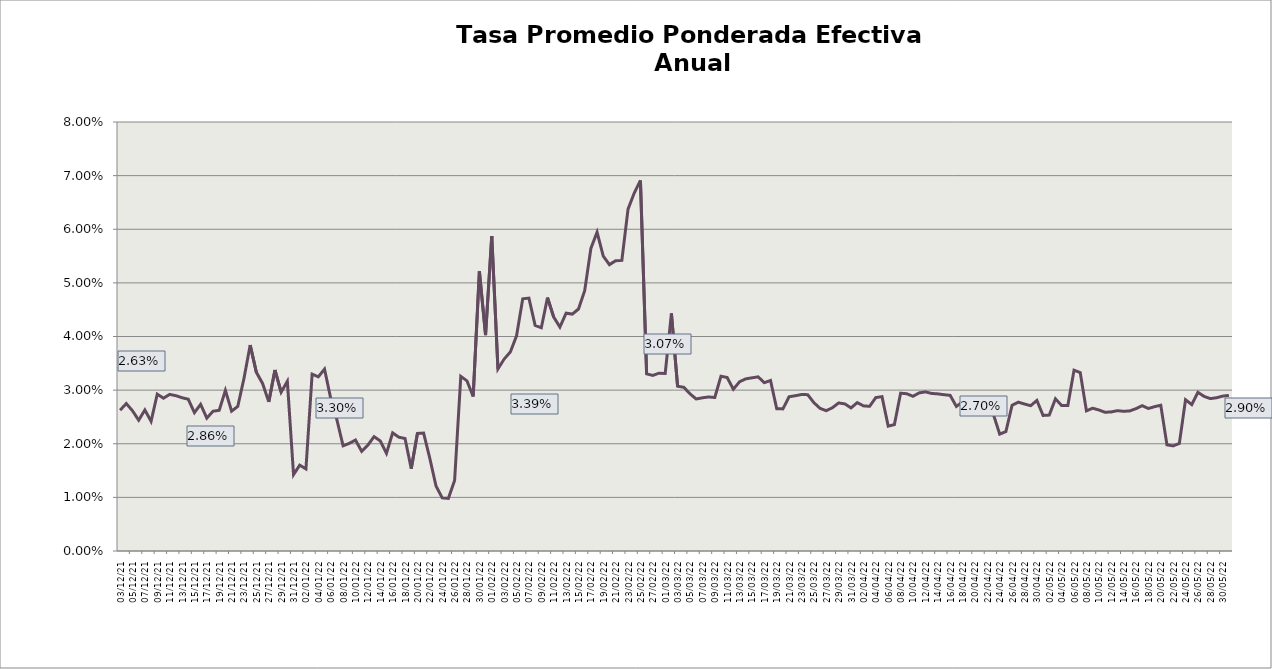
| Category | Tasa Efectiva Anual |
|---|---|
| 2021-12-03 | 0.026 |
| 2021-12-04 | 0.027 |
| 2021-12-05 | 0.026 |
| 2021-12-06 | 0.024 |
| 2021-12-07 | 0.026 |
| 2021-12-08 | 0.024 |
| 2021-12-09 | 0.029 |
| 2021-12-10 | 0.028 |
| 2021-12-11 | 0.029 |
| 2021-12-12 | 0.029 |
| 2021-12-13 | 0.029 |
| 2021-12-14 | 0.028 |
| 2021-12-15 | 0.026 |
| 2021-12-16 | 0.027 |
| 2021-12-17 | 0.025 |
| 2021-12-18 | 0.026 |
| 2021-12-19 | 0.026 |
| 2021-12-20 | 0.03 |
| 2021-12-21 | 0.026 |
| 2021-12-22 | 0.027 |
| 2021-12-23 | 0.032 |
| 2021-12-24 | 0.038 |
| 2021-12-25 | 0.033 |
| 2021-12-26 | 0.031 |
| 2021-12-27 | 0.028 |
| 2021-12-28 | 0.034 |
| 2021-12-29 | 0.03 |
| 2021-12-30 | 0.032 |
| 2021-12-31 | 0.014 |
| 2022-01-01 | 0.016 |
| 2022-01-02 | 0.015 |
| 2022-01-03 | 0.033 |
| 2022-01-04 | 0.032 |
| 2022-01-05 | 0.034 |
| 2022-01-06 | 0.028 |
| 2022-01-07 | 0.024 |
| 2022-01-08 | 0.02 |
| 2022-01-09 | 0.02 |
| 2022-01-10 | 0.021 |
| 2022-01-11 | 0.019 |
| 2022-01-12 | 0.02 |
| 2022-01-13 | 0.021 |
| 2022-01-14 | 0.021 |
| 2022-01-15 | 0.018 |
| 2022-01-16 | 0.022 |
| 2022-01-17 | 0.021 |
| 2022-01-18 | 0.021 |
| 2022-01-19 | 0.015 |
| 2022-01-20 | 0.022 |
| 2022-01-21 | 0.022 |
| 2022-01-22 | 0.017 |
| 2022-01-23 | 0.012 |
| 2022-01-24 | 0.01 |
| 2022-01-25 | 0.01 |
| 2022-01-26 | 0.013 |
| 2022-01-27 | 0.033 |
| 2022-01-28 | 0.032 |
| 2022-01-29 | 0.029 |
| 2022-01-30 | 0.052 |
| 2022-01-31 | 0.04 |
| 2022-02-01 | 0.059 |
| 2022-02-02 | 0.034 |
| 2022-02-03 | 0.036 |
| 2022-02-04 | 0.037 |
| 2022-02-05 | 0.04 |
| 2022-02-06 | 0.047 |
| 2022-02-07 | 0.047 |
| 2022-02-08 | 0.042 |
| 2022-02-09 | 0.042 |
| 2022-02-10 | 0.047 |
| 2022-02-11 | 0.044 |
| 2022-02-12 | 0.042 |
| 2022-02-13 | 0.044 |
| 2022-02-14 | 0.044 |
| 2022-02-15 | 0.045 |
| 2022-02-16 | 0.049 |
| 2022-02-17 | 0.056 |
| 2022-02-18 | 0.059 |
| 2022-02-19 | 0.055 |
| 2022-02-20 | 0.053 |
| 2022-02-21 | 0.054 |
| 2022-02-22 | 0.054 |
| 2022-02-23 | 0.064 |
| 2022-02-24 | 0.067 |
| 2022-02-25 | 0.069 |
| 2022-02-26 | 0.033 |
| 2022-02-27 | 0.033 |
| 2022-02-28 | 0.033 |
| 2022-03-01 | 0.033 |
| 2022-03-02 | 0.044 |
| 2022-03-03 | 0.031 |
| 2022-03-04 | 0.031 |
| 2022-03-05 | 0.029 |
| 2022-03-06 | 0.028 |
| 2022-03-07 | 0.029 |
| 2022-03-08 | 0.029 |
| 2022-03-09 | 0.029 |
| 2022-03-10 | 0.033 |
| 2022-03-11 | 0.032 |
| 2022-03-12 | 0.03 |
| 2022-03-13 | 0.032 |
| 2022-03-14 | 0.032 |
| 2022-03-15 | 0.032 |
| 2022-03-16 | 0.032 |
| 2022-03-17 | 0.031 |
| 2022-03-18 | 0.032 |
| 2022-03-19 | 0.027 |
| 2022-03-20 | 0.027 |
| 2022-03-21 | 0.029 |
| 2022-03-22 | 0.029 |
| 2022-03-23 | 0.029 |
| 2022-03-24 | 0.029 |
| 2022-03-25 | 0.028 |
| 2022-03-26 | 0.027 |
| 2022-03-27 | 0.026 |
| 2022-03-28 | 0.027 |
| 2022-03-29 | 0.028 |
| 2022-03-30 | 0.027 |
| 2022-03-31 | 0.027 |
| 2022-04-01 | 0.028 |
| 2022-04-02 | 0.027 |
| 2022-04-03 | 0.027 |
| 2022-04-04 | 0.029 |
| 2022-04-05 | 0.029 |
| 2022-04-06 | 0.023 |
| 2022-04-07 | 0.024 |
| 2022-04-08 | 0.029 |
| 2022-04-09 | 0.029 |
| 2022-04-10 | 0.029 |
| 2022-04-11 | 0.029 |
| 2022-04-12 | 0.03 |
| 2022-04-13 | 0.029 |
| 2022-04-14 | 0.029 |
| 2022-04-15 | 0.029 |
| 2022-04-16 | 0.029 |
| 2022-04-17 | 0.027 |
| 2022-04-18 | 0.028 |
| 2022-04-19 | 0.028 |
| 2022-04-20 | 0.026 |
| 2022-04-21 | 0.026 |
| 2022-04-22 | 0.026 |
| 2022-04-23 | 0.025 |
| 2022-04-24 | 0.022 |
| 2022-04-25 | 0.022 |
| 2022-04-26 | 0.027 |
| 2022-04-27 | 0.028 |
| 2022-04-28 | 0.027 |
| 2022-04-29 | 0.027 |
| 2022-04-30 | 0.028 |
| 2022-05-01 | 0.025 |
| 2022-05-02 | 0.025 |
| 2022-05-03 | 0.028 |
| 2022-05-04 | 0.027 |
| 2022-05-05 | 0.027 |
| 2022-05-06 | 0.034 |
| 2022-05-07 | 0.033 |
| 2022-05-08 | 0.026 |
| 2022-05-09 | 0.027 |
| 2022-05-10 | 0.026 |
| 2022-05-11 | 0.026 |
| 2022-05-12 | 0.026 |
| 2022-05-13 | 0.026 |
| 2022-05-14 | 0.026 |
| 2022-05-15 | 0.026 |
| 2022-05-16 | 0.027 |
| 2022-05-17 | 0.027 |
| 2022-05-18 | 0.027 |
| 2022-05-19 | 0.027 |
| 2022-05-20 | 0.027 |
| 2022-05-21 | 0.02 |
| 2022-05-22 | 0.02 |
| 2022-05-23 | 0.02 |
| 2022-05-24 | 0.028 |
| 2022-05-25 | 0.027 |
| 2022-05-26 | 0.03 |
| 2022-05-27 | 0.029 |
| 2022-05-28 | 0.028 |
| 2022-05-29 | 0.029 |
| 2022-05-30 | 0.029 |
| 2022-05-31 | 0.029 |